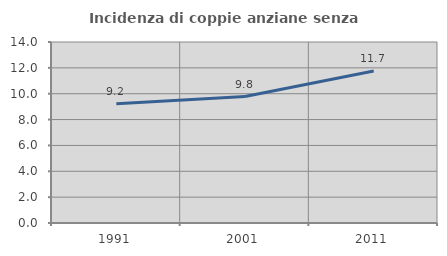
| Category | Incidenza di coppie anziane senza figli  |
|---|---|
| 1991.0 | 9.219 |
| 2001.0 | 9.781 |
| 2011.0 | 11.75 |